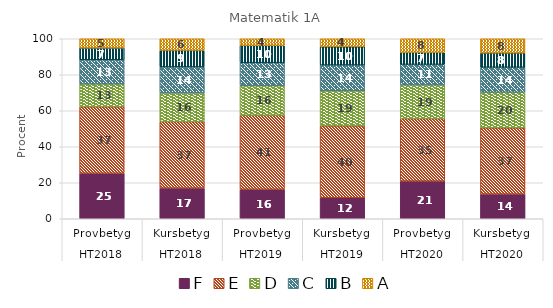
| Category | F | E | D | C | B | A |
|---|---|---|---|---|---|---|
| 0 | 25.275 | 36.951 | 12.637 | 13.462 | 6.593 | 5.082 |
| 1 | 17.033 | 36.951 | 15.934 | 14.423 | 9.203 | 6.456 |
| 2 | 16.372 | 41.15 | 16.372 | 12.832 | 9.587 | 3.687 |
| 3 | 11.652 | 39.971 | 19.469 | 14.307 | 10.177 | 4.425 |
| 4 | 20.951 | 34.683 | 18.662 | 11.444 | 6.69 | 7.57 |
| 5 | 13.732 | 36.796 | 19.718 | 13.908 | 7.923 | 7.923 |